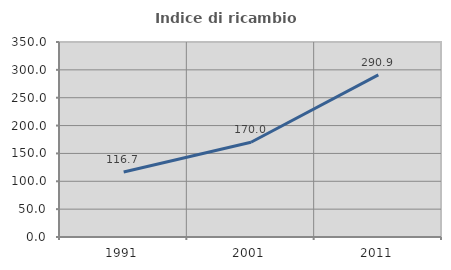
| Category | Indice di ricambio occupazionale  |
|---|---|
| 1991.0 | 116.667 |
| 2001.0 | 170 |
| 2011.0 | 290.909 |